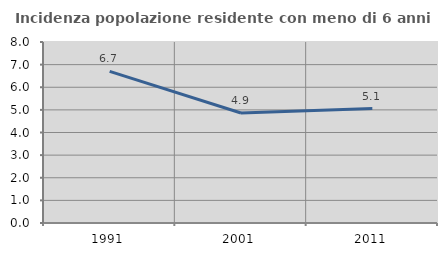
| Category | Incidenza popolazione residente con meno di 6 anni |
|---|---|
| 1991.0 | 6.701 |
| 2001.0 | 4.862 |
| 2011.0 | 5.059 |